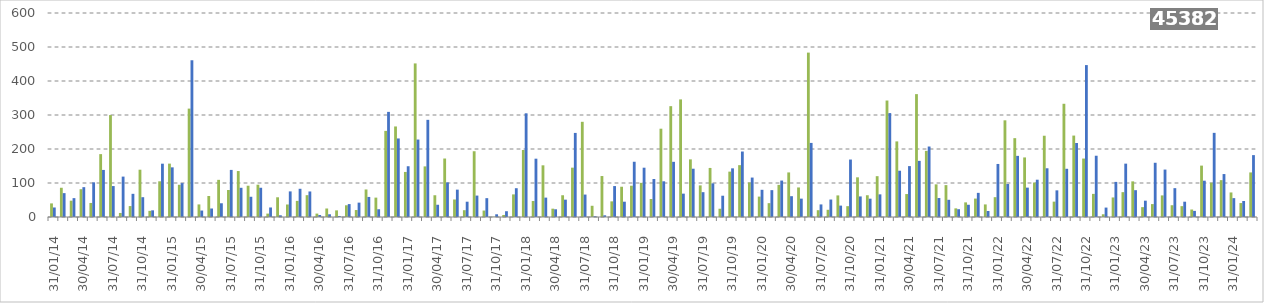
| Category | Stripped .000 000 | Reconstituted .000 000 |
|---|---|---|
| 2014-01-31 | 40 | 28 |
| 2014-02-28 | 86 | 70.2 |
| 2014-03-31 | 48 | 55.5 |
| 2014-04-30 | 81.76 | 87.76 |
| 2014-05-31 | 41.3 | 101.98 |
| 2014-06-30 | 184.92 | 138.42 |
| 2014-07-31 | 299.8 | 91 |
| 2014-08-31 | 11.88 | 118.81 |
| 2014-09-30 | 32.16 | 68.16 |
| 2014-10-31 | 139.1 | 58.25 |
| 2014-11-30 | 18.11 | 19.6 |
| 2014-12-31 | 105 | 156.8 |
| 2015-01-31 | 157 | 146 |
| 2015-02-28 | 94.75 | 99.63 |
| 2015-03-31 | 318.8 | 461 |
| 2015-04-30 | 37 | 19 |
| 2015-05-31 | 61.8 | 25 |
| 2015-06-30 | 109.3 | 40.4 |
| 2015-07-31 | 79.5 | 138.5 |
| 2015-08-31 | 135.2 | 85.9 |
| 2015-09-30 | 92 | 59.5 |
| 2015-10-31 | 95 | 86 |
| 2015-11-30 | 10 | 28 |
| 2015-12-31 | 58 | 5 |
| 2016-01-31 | 36.8 | 75.3 |
| 2016-02-29 | 47.4 | 83 |
| 2016-03-31 | 64.2 | 75.1 |
| 2016-04-30 | 10 | 5.8 |
| 2016-05-31 | 25 | 8 |
| 2016-06-30 | 19.5 | 3 |
| 2016-07-31 | 34.5 | 38 |
| 2016-08-31 | 20.49 | 42.25 |
| 2016-09-30 | 81 | 59 |
| 2016-10-31 | 57 | 22.8 |
| 2016-11-30 | 253.3 | 309.2 |
| 2016-12-31 | 266.3 | 231 |
| 2017-01-31 | 132.5 | 149.3 |
| 2017-02-28 | 451.7 | 227.8 |
| 2017-03-31 | 148.85 | 285.8 |
| 2017-04-30 | 64 | 36 |
| 2017-05-31 | 172 | 101.8 |
| 2017-06-30 | 51.5 | 80.5 |
| 2017-07-31 | 20 | 45 |
| 2017-08-31 | 193.4 | 63 |
| 2017-09-30 | 19 | 55.44 |
| 2017-10-31 | 1 | 8 |
| 2017-11-30 | 6 | 17 |
| 2017-12-31 | 66.5 | 84.7 |
| 2018-01-31 | 197 | 305 |
| 2018-02-28 | 47 | 171.5 |
| 2018-03-31 | 152 | 57 |
| 2018-04-30 | 24.5 | 22.7 |
| 2018-05-31 | 64 | 51 |
| 2018-06-30 | 145.1 | 247.3 |
| 2018-07-31 | 280 | 66 |
| 2018-08-31 | 33 | 2 |
| 2018-09-30 | 120.5 | 5 |
| 2018-10-31 | 46 | 91 |
| 2018-11-30 | 89 | 45 |
| 2018-12-31 | 92 | 162.5 |
| 2019-01-31 | 100.5 | 145 |
| 2019-02-02 | 53 | 111.8 |
| 2019-03-31 | 259.7 | 105 |
| 2019-04-30 | 326 | 162.3 |
| 2019-05-31 | 345.9 | 68.7 |
| 2019-06-30 | 169.5 | 142 |
| 2019-07-31 | 93 | 73 |
| 2019-08-31 | 144.3 | 98.9 |
| 2019-09-30 | 24.3 | 62.6 |
| 2019-10-31 | 133.45 | 143.1 |
| 2019-11-30 | 152.5 | 192.6 |
| 2019-12-31 | 101.5 | 116 |
| 2020-01-31 | 60 | 80 |
| 2020-02-29 | 40.7 | 79 |
| 2020-03-31 | 94.5 | 107.2 |
| 2020-04-30 | 131.1 | 61.2 |
| 2020-05-31 | 86.9 | 54 |
| 2020-06-30 | 483.5 | 217.9 |
| 2020-07-31 | 20 | 37 |
| 2020-08-31 | 21.2 | 51.4 |
| 2020-09-30 | 63.5 | 33.5 |
| 2020-10-31 | 31.9 | 169 |
| 2020-11-30 | 116.7 | 60.5 |
| 2020-12-31 | 64 | 53.9 |
| 2021-01-31 | 120.1 | 66.6 |
| 2021-02-28 | 342.58 | 305.64 |
| 2021-03-31 | 222.35 | 136.1 |
| 2021-04-30 | 67.5 | 149.7 |
| 2021-05-31 | 361.4 | 165.12 |
| 2021-06-30 | 194.5 | 207.3 |
| 2021-07-31 | 96 | 55.8 |
| 2021-08-31 | 93.8 | 50.6 |
| 2021-09-30 | 25.4 | 22.9 |
| 2021-10-31 | 43 | 36 |
| 2021-11-30 | 54.2 | 71 |
| 2021-12-31 | 37 | 17.6 |
| 2022-01-31 | 58.3 | 156 |
| 2022-02-28 | 284.35 | 97 |
| 2022-03-31 | 231.9 | 179.8 |
| 2022-04-30 | 175.2 | 86.4 |
| 2022-05-31 | 101.4 | 109.7 |
| 2022-06-30 | 239 | 143.3 |
| 2022-07-31 | 45.2 | 78.4 |
| 2022-08-31 | 333 | 141.8 |
| 2022-09-30 | 239.5 | 217.7 |
| 2022-10-31 | 171.9 | 446.8 |
| 2022-11-30 | 68 | 180.2 |
| 2022-12-31 | 8 | 27.7 |
| 2023-01-31 | 57.5 | 103.23 |
| 2023-02-28 | 73.1 | 156.93 |
| 2023-03-31 | 104.8 | 78.9 |
| 2023-04-30 | 29 | 48 |
| 2023-05-31 | 38 | 159.5 |
| 2023-06-30 | 63.5 | 139.5 |
| 2023-07-31 | 34.6 | 84.85 |
| 2023-08-31 | 31.9 | 45 |
| 2023-09-30 | 22 | 18 |
| 2023-10-31 | 151.15 | 106.79 |
| 2023-11-30 | 100.9 | 247.5 |
| 2023-12-31 | 108.4 | 126.3 |
| 2024-01-31 | 72.2 | 55.5 |
| 2024-02-29 | 41 | 47.1 |
| 2024-03-31 | 131.1 | 182 |